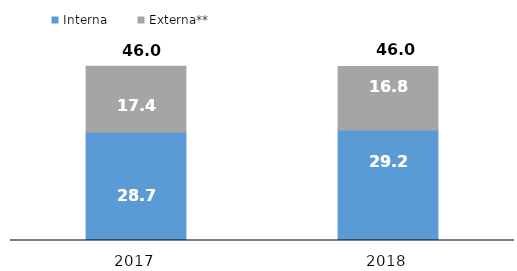
| Category | Interna | Externa** |
|---|---|---|
| 2017.0 | 28.7 | 17.4 |
| 2018.0 | 29.2 | 16.8 |